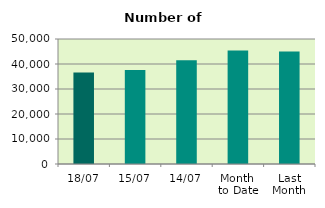
| Category | Series 0 |
|---|---|
| 18/07 | 36638 |
| 15/07 | 37618 |
| 14/07 | 41504 |
| Month 
to Date | 45395.833 |
| Last
Month | 45009.909 |